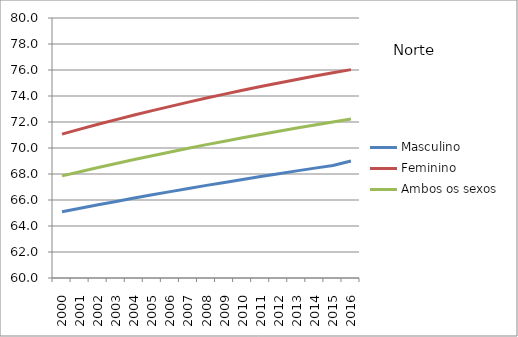
| Category | Masculino | Feminino | Ambos os sexos |
|---|---|---|---|
| 2000.0 | 65.099 | 71.064 | 67.853 |
| 2001.0 | 65.368 | 71.449 | 68.178 |
| 2002.0 | 65.631 | 71.823 | 68.495 |
| 2003.0 | 65.89 | 72.181 | 68.804 |
| 2004.0 | 66.147 | 72.533 | 69.109 |
| 2005.0 | 66.4 | 72.874 | 69.407 |
| 2006.0 | 66.645 | 73.204 | 69.696 |
| 2007.0 | 66.886 | 73.526 | 69.98 |
| 2008.0 | 67.124 | 73.841 | 70.258 |
| 2009.0 | 67.353 | 74.144 | 70.526 |
| 2010.0 | 67.583 | 74.439 | 70.79 |
| 2011.0 | 67.805 | 74.729 | 71.046 |
| 2012.0 | 68.025 | 75.005 | 71.294 |
| 2013.0 | 68.241 | 75.273 | 71.537 |
| 2014.0 | 68.451 | 75.535 | 71.773 |
| 2015.0 | 68.657 | 75.786 | 72.002 |
| 2016.0 | 69 | 76.03 | 72.226 |